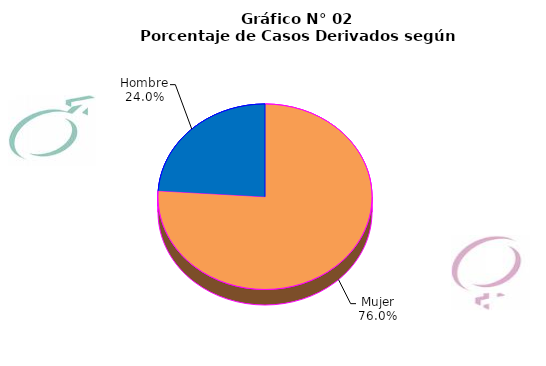
| Category | Series 0 |
|---|---|
| Mujer | 298 |
| Hombre | 94 |